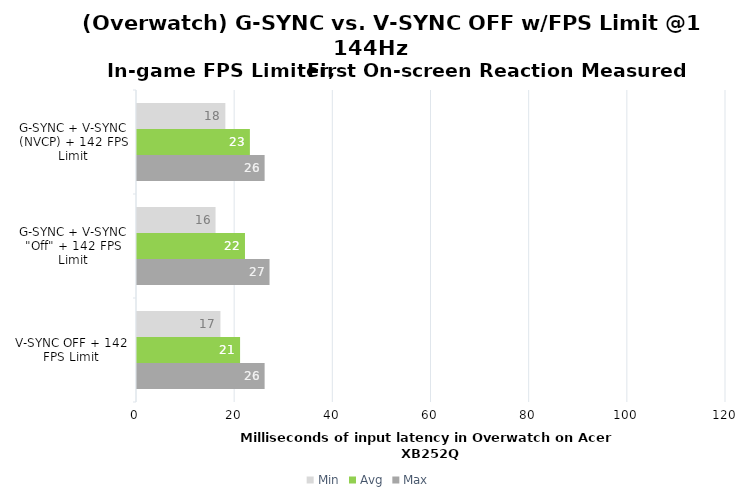
| Category | Min | Avg | Max |
|---|---|---|---|
| G-SYNC + V-SYNC (NVCP) + 142 FPS Limit | 18 | 23 | 26 |
| G-SYNC + V-SYNC "Off" + 142 FPS Limit | 16 | 22 | 27 |
| V-SYNC OFF + 142 FPS Limit | 17 | 21 | 26 |